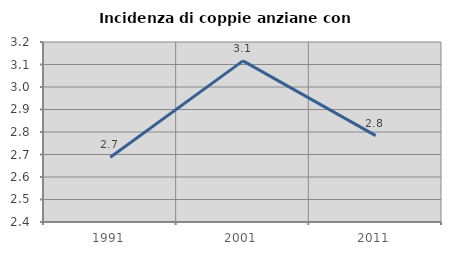
| Category | Incidenza di coppie anziane con figli |
|---|---|
| 1991.0 | 2.688 |
| 2001.0 | 3.116 |
| 2011.0 | 2.784 |